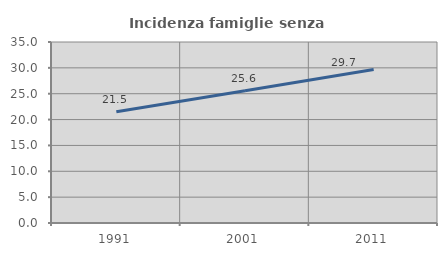
| Category | Incidenza famiglie senza nuclei |
|---|---|
| 1991.0 | 21.522 |
| 2001.0 | 25.586 |
| 2011.0 | 29.675 |